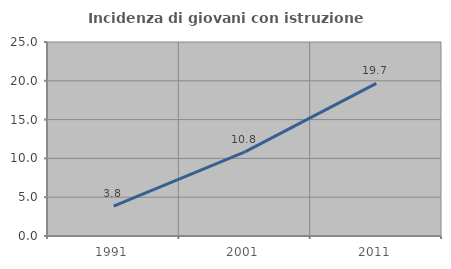
| Category | Incidenza di giovani con istruzione universitaria |
|---|---|
| 1991.0 | 3.846 |
| 2001.0 | 10.843 |
| 2011.0 | 19.672 |